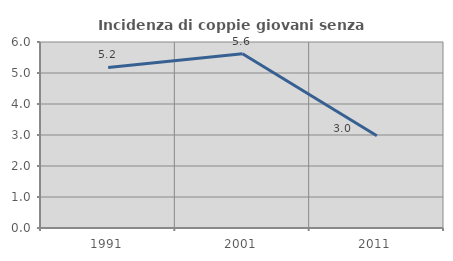
| Category | Incidenza di coppie giovani senza figli |
|---|---|
| 1991.0 | 5.179 |
| 2001.0 | 5.622 |
| 2011.0 | 2.979 |